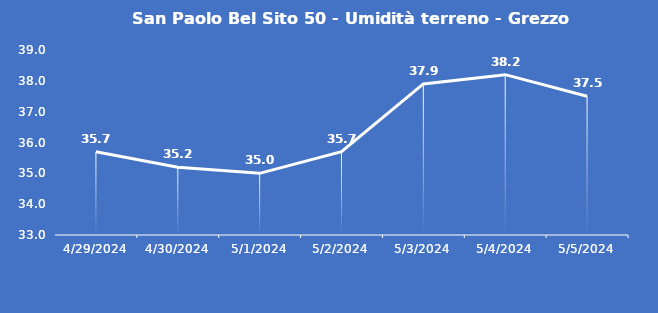
| Category | San Paolo Bel Sito 50 - Umidità terreno - Grezzo (%VWC) |
|---|---|
| 4/29/24 | 35.7 |
| 4/30/24 | 35.2 |
| 5/1/24 | 35 |
| 5/2/24 | 35.7 |
| 5/3/24 | 37.9 |
| 5/4/24 | 38.2 |
| 5/5/24 | 37.5 |